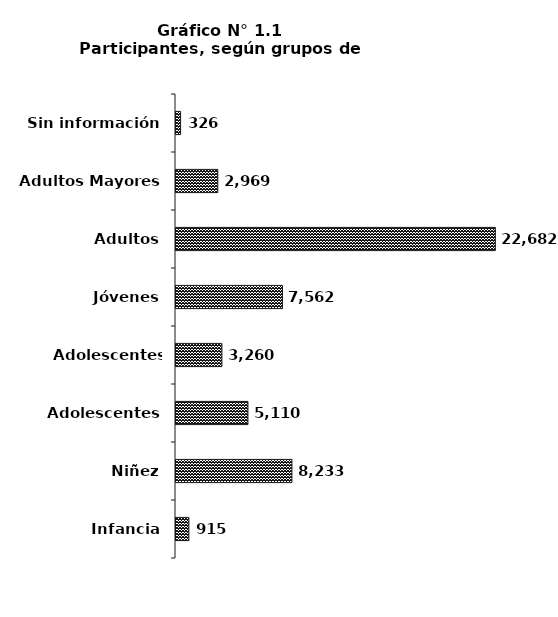
| Category | Series 0 |
|---|---|
| Infancia | 915 |
| Niñez | 8233 |
| Adolescentes | 5110 |
| Adolescentes Tardios | 3260 |
| Jóvenes | 7562 |
| Adultos | 22682 |
| Adultos Mayores | 2969 |
| Sin información | 326 |